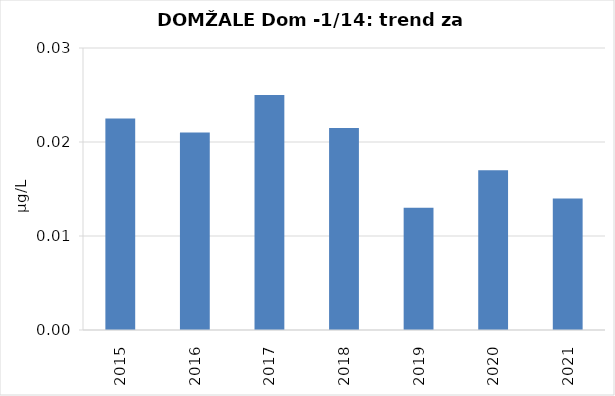
| Category | Vsota |
|---|---|
| 2015 | 0.022 |
| 2016 | 0.021 |
| 2017 | 0.025 |
| 2018 | 0.022 |
| 2019 | 0.013 |
| 2020 | 0.017 |
| 2021 | 0.014 |